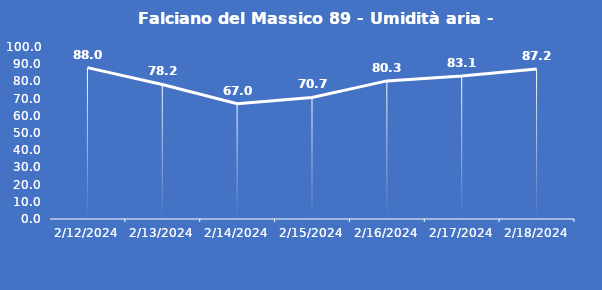
| Category | Falciano del Massico 89 - Umidità aria - Grezzo (%) |
|---|---|
| 2/12/24 | 88 |
| 2/13/24 | 78.2 |
| 2/14/24 | 67 |
| 2/15/24 | 70.7 |
| 2/16/24 | 80.3 |
| 2/17/24 | 83.1 |
| 2/18/24 | 87.2 |